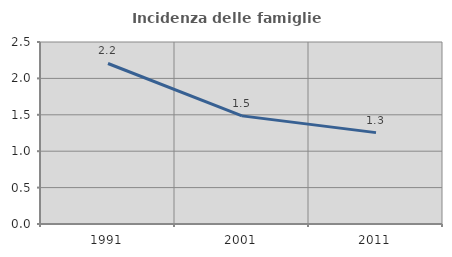
| Category | Incidenza delle famiglie numerose |
|---|---|
| 1991.0 | 2.205 |
| 2001.0 | 1.485 |
| 2011.0 | 1.255 |